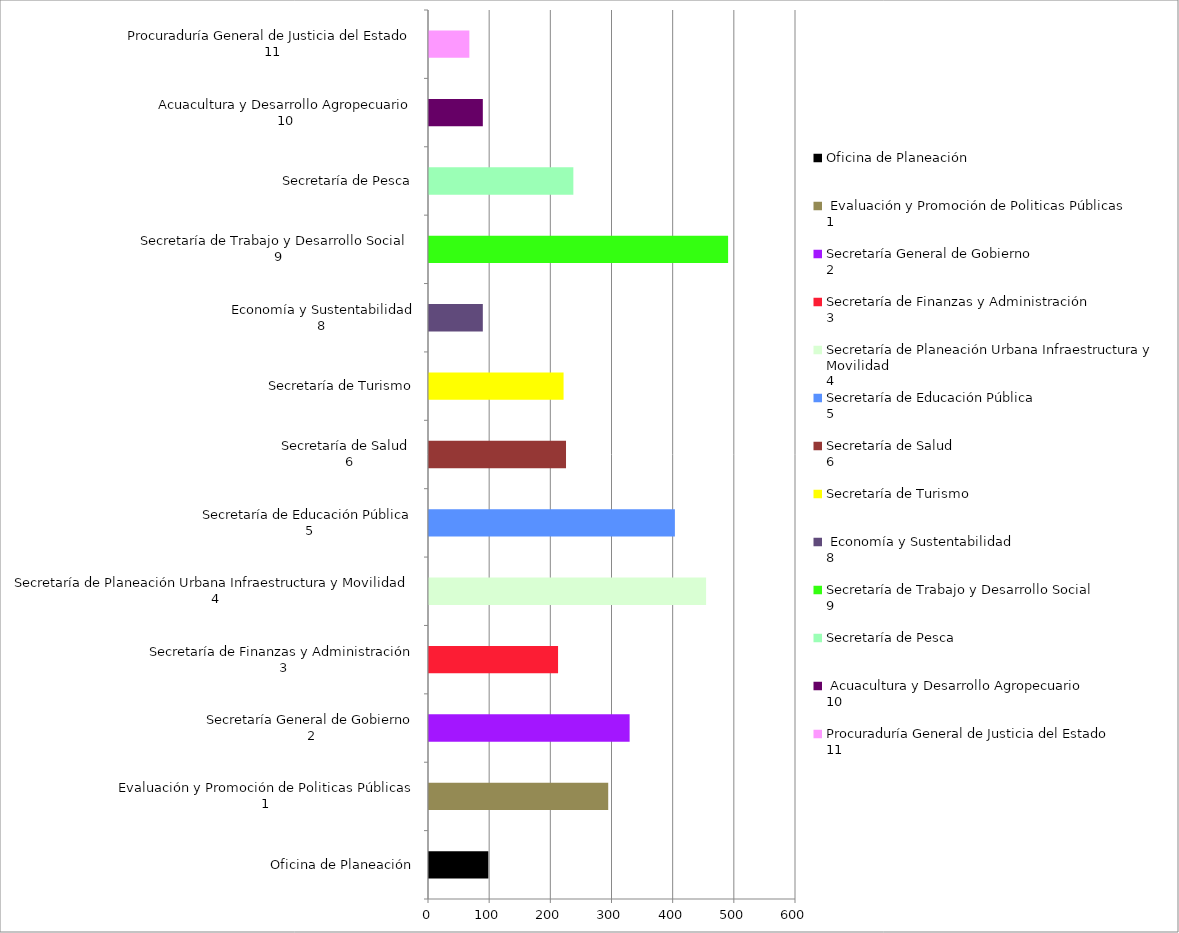
| Category | Series 0 |
|---|---|
| 0 | 97 |
| 1 | 293 |
| 2 | 328 |
| 3 | 211 |
| 4 | 453 |
| 5 | 402 |
| 6 | 224 |
| 7 | 220 |
| 8 | 88 |
| 9 | 489 |
| 10 | 236 |
| 11 | 88 |
| 12 | 66 |